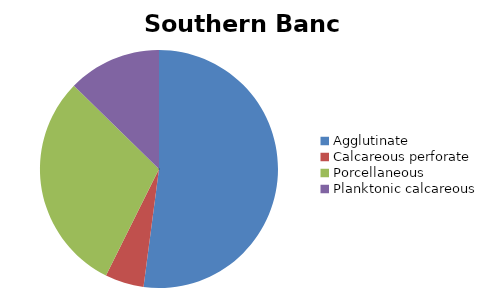
| Category | Southern Banc d'Arguin |
|---|---|
| ﻿Agglutinate | 52.079 |
| Calcareous perforate | 5.27 |
| Porcellaneous | 29.968 |
| Planktonic calcareous | 12.683 |